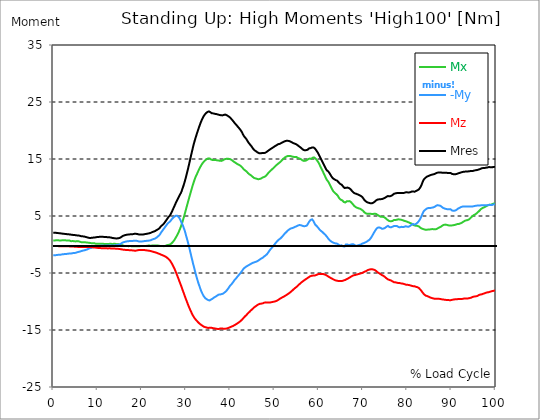
| Category |  Mx |  -My |  Mz |  Mres |
|---|---|---|---|---|
| 0.0 | 0.705 | -1.894 | -0.278 | 2.042 |
| 0.167348456675344 | 0.705 | -1.894 | -0.26 | 2.042 |
| 0.334696913350688 | 0.705 | -1.894 | -0.26 | 2.042 |
| 0.5020453700260321 | 0.743 | -1.875 | -0.278 | 2.042 |
| 0.669393826701376 | 0.761 | -1.856 | -0.278 | 2.042 |
| 0.83674228337672 | 0.78 | -1.838 | -0.278 | 2.023 |
| 1.0040907400520642 | 0.761 | -1.819 | -0.278 | 2.005 |
| 1.1621420602454444 | 0.724 | -1.838 | -0.278 | 2.005 |
| 1.3294905169207885 | 0.705 | -1.819 | -0.297 | 1.986 |
| 1.4968389735961325 | 0.687 | -1.801 | -0.297 | 1.968 |
| 1.6641874302714765 | 0.705 | -1.782 | -0.297 | 1.949 |
| 1.8315358869468206 | 0.724 | -1.764 | -0.297 | 1.931 |
| 1.9988843436221646 | 0.743 | -1.726 | -0.297 | 1.912 |
| 2.1662328002975086 | 0.743 | -1.708 | -0.297 | 1.894 |
| 2.333581256972853 | 0.724 | -1.708 | -0.297 | 1.875 |
| 2.5009297136481967 | 0.705 | -1.689 | -0.297 | 1.856 |
| 2.6682781703235405 | 0.743 | -1.652 | -0.297 | 1.856 |
| 2.8356266269988843 | 0.743 | -1.652 | -0.316 | 1.838 |
| 3.002975083674229 | 0.705 | -1.652 | -0.316 | 1.819 |
| 3.1703235403495724 | 0.687 | -1.634 | -0.316 | 1.819 |
| 3.337671997024917 | 0.705 | -1.615 | -0.316 | 1.801 |
| 3.4957233172182973 | 0.705 | -1.596 | -0.316 | 1.782 |
| 3.663071773893641 | 0.687 | -1.578 | -0.334 | 1.764 |
| 3.8304202305689854 | 0.631 | -1.578 | -0.353 | 1.745 |
| 3.997768687244329 | 0.575 | -1.578 | -0.353 | 1.726 |
| 4.165117143919673 | 0.594 | -1.541 | -0.353 | 1.708 |
| 4.332465600595017 | 0.613 | -1.522 | -0.353 | 1.689 |
| 4.499814057270361 | 0.613 | -1.504 | -0.371 | 1.671 |
| 4.667162513945706 | 0.575 | -1.485 | -0.371 | 1.671 |
| 4.834510970621049 | 0.557 | -1.485 | -0.39 | 1.652 |
| 5.001859427296393 | 0.538 | -1.467 | -0.39 | 1.634 |
| 5.169207883971737 | 0.538 | -1.429 | -0.39 | 1.615 |
| 5.336556340647081 | 0.594 | -1.374 | -0.408 | 1.596 |
| 5.503904797322425 | 0.575 | -1.337 | -0.427 | 1.578 |
| 5.671253253997769 | 0.575 | -1.299 | -0.427 | 1.596 |
| 5.82930457419115 | 0.538 | -1.281 | -0.446 | 1.578 |
| 5.996653030866494 | 0.483 | -1.244 | -0.446 | 1.522 |
| 6.164001487541838 | 0.446 | -1.188 | -0.427 | 1.485 |
| 6.331349944217181 | 0.408 | -1.151 | -0.427 | 1.448 |
| 6.498698400892526 | 0.408 | -1.095 | -0.427 | 1.429 |
| 6.66604685756787 | 0.408 | -1.077 | -0.427 | 1.429 |
| 6.833395314243213 | 0.408 | -1.058 | -0.427 | 1.429 |
| 7.000743770918558 | 0.408 | -1.021 | -0.427 | 1.392 |
| 7.168092227593902 | 0.408 | -0.984 | -0.427 | 1.355 |
| 7.335440684269246 | 0.371 | -0.947 | -0.427 | 1.318 |
| 7.50278914094459 | 0.353 | -0.891 | -0.427 | 1.281 |
| 7.6701375976199335 | 0.334 | -0.854 | -0.427 | 1.244 |
| 7.837486054295278 | 0.316 | -0.798 | -0.446 | 1.207 |
| 7.995537374488658 | 0.316 | -0.724 | -0.446 | 1.17 |
| 8.162885831164003 | 0.297 | -0.668 | -0.446 | 1.151 |
| 8.330234287839346 | 0.26 | -0.631 | -0.446 | 1.151 |
| 8.49758274451469 | 0.223 | -0.594 | -0.464 | 1.151 |
| 8.664931201190035 | 0.223 | -0.557 | -0.483 | 1.17 |
| 8.832279657865378 | 0.223 | -0.501 | -0.483 | 1.188 |
| 8.999628114540721 | 0.223 | -0.483 | -0.501 | 1.207 |
| 9.166976571216066 | 0.223 | -0.446 | -0.52 | 1.225 |
| 9.334325027891412 | 0.204 | -0.427 | -0.538 | 1.225 |
| 9.501673484566755 | 0.167 | -0.39 | -0.538 | 1.244 |
| 9.669021941242098 | 0.111 | -0.371 | -0.557 | 1.281 |
| 9.836370397917442 | 0.149 | -0.316 | -0.575 | 1.299 |
| 10.003718854592787 | 0.149 | -0.297 | -0.594 | 1.318 |
| 10.17106731126813 | 0.149 | -0.278 | -0.594 | 1.318 |
| 10.329118631461512 | 0.13 | -0.278 | -0.613 | 1.337 |
| 10.496467088136853 | 0.13 | -0.26 | -0.631 | 1.355 |
| 10.663815544812199 | 0.111 | -0.223 | -0.631 | 1.374 |
| 10.831164001487544 | 0.13 | -0.204 | -0.65 | 1.392 |
| 10.998512458162887 | 0.13 | -0.186 | -0.668 | 1.374 |
| 11.16586091483823 | 0.13 | -0.186 | -0.668 | 1.355 |
| 11.333209371513574 | 0.111 | -0.204 | -0.668 | 1.337 |
| 11.50055782818892 | 0.093 | -0.204 | -0.668 | 1.318 |
| 11.667906284864264 | 0.074 | -0.204 | -0.668 | 1.318 |
| 11.835254741539607 | 0.056 | -0.186 | -0.668 | 1.318 |
| 12.00260319821495 | 0.074 | -0.167 | -0.668 | 1.299 |
| 12.169951654890292 | 0.093 | -0.149 | -0.687 | 1.299 |
| 12.337300111565641 | 0.074 | -0.167 | -0.687 | 1.281 |
| 12.504648568240984 | 0.093 | -0.167 | -0.668 | 1.281 |
| 12.662699888434362 | 0.111 | -0.167 | -0.668 | 1.262 |
| 12.830048345109708 | 0.13 | -0.149 | -0.687 | 1.244 |
| 12.997396801785053 | 0.13 | -0.167 | -0.687 | 1.225 |
| 13.164745258460396 | 0.074 | -0.167 | -0.687 | 1.188 |
| 13.33209371513574 | 0.056 | -0.167 | -0.687 | 1.151 |
| 13.499442171811083 | 0.093 | -0.186 | -0.687 | 1.132 |
| 13.666790628486426 | 0.13 | -0.167 | -0.687 | 1.114 |
| 13.834139085161771 | 0.149 | -0.149 | -0.705 | 1.095 |
| 14.001487541837117 | 0.111 | -0.149 | -0.724 | 1.077 |
| 14.16883599851246 | 0.074 | -0.13 | -0.724 | 1.058 |
| 14.336184455187803 | 0.056 | -0.093 | -0.743 | 1.058 |
| 14.503532911863147 | 0.056 | -0.056 | -0.743 | 1.077 |
| 14.670881368538492 | 0.074 | -0.056 | -0.761 | 1.095 |
| 14.828932688731873 | 0.019 | -0.019 | -0.78 | 1.114 |
| 14.996281145407215 | -0.019 | 0.019 | -0.798 | 1.151 |
| 15.163629602082558 | -0.056 | 0.074 | -0.817 | 1.225 |
| 15.330978058757903 | -0.111 | 0.167 | -0.835 | 1.299 |
| 15.498326515433247 | -0.111 | 0.223 | -0.854 | 1.355 |
| 15.665674972108594 | -0.149 | 0.353 | -0.891 | 1.485 |
| 15.833023428783937 | -0.204 | 0.408 | -0.91 | 1.559 |
| 16.00037188545928 | -0.241 | 0.427 | -0.928 | 1.596 |
| 16.167720342134626 | -0.241 | 0.464 | -0.928 | 1.634 |
| 16.335068798809967 | -0.241 | 0.501 | -0.947 | 1.671 |
| 16.502417255485312 | -0.26 | 0.52 | -0.965 | 1.689 |
| 16.669765712160658 | -0.26 | 0.557 | -0.965 | 1.726 |
| 16.837114168836 | -0.26 | 0.575 | -0.984 | 1.726 |
| 17.004462625511344 | -0.297 | 0.575 | -0.984 | 1.745 |
| 17.16251394570472 | -0.297 | 0.613 | -0.984 | 1.764 |
| 17.32986240238007 | -0.26 | 0.631 | -1.002 | 1.782 |
| 17.497210859055414 | -0.278 | 0.631 | -1.021 | 1.782 |
| 17.664559315730756 | -0.297 | 0.613 | -1.021 | 1.782 |
| 17.8319077724061 | -0.316 | 0.613 | -1.021 | 1.801 |
| 17.999256229081443 | -0.316 | 0.631 | -1.04 | 1.819 |
| 18.166604685756788 | -0.297 | 0.65 | -1.058 | 1.838 |
| 18.333953142432133 | -0.316 | 0.668 | -1.077 | 1.875 |
| 18.501301599107478 | -0.316 | 0.687 | -1.095 | 1.894 |
| 18.668650055782823 | -0.316 | 0.668 | -1.077 | 1.875 |
| 18.835998512458165 | -0.316 | 0.631 | -1.058 | 1.856 |
| 19.00334696913351 | -0.316 | 0.613 | -1.021 | 1.838 |
| 19.170695425808855 | -0.297 | 0.575 | -1.002 | 1.801 |
| 19.338043882484197 | -0.316 | 0.538 | -0.965 | 1.764 |
| 19.496095202677576 | -0.297 | 0.538 | -0.965 | 1.764 |
| 19.66344365935292 | -0.278 | 0.538 | -0.965 | 1.745 |
| 19.830792116028263 | -0.297 | 0.538 | -0.947 | 1.745 |
| 19.998140572703612 | -0.278 | 0.538 | -0.947 | 1.764 |
| 20.165489029378953 | -0.26 | 0.538 | -0.947 | 1.764 |
| 20.3328374860543 | -0.241 | 0.557 | -0.947 | 1.764 |
| 20.500185942729644 | -0.241 | 0.594 | -0.965 | 1.782 |
| 20.667534399404985 | -0.26 | 0.613 | -0.984 | 1.819 |
| 20.83488285608033 | -0.297 | 0.613 | -1.002 | 1.819 |
| 21.002231312755672 | -0.26 | 0.631 | -1.021 | 1.856 |
| 21.16957976943102 | -0.223 | 0.65 | -1.04 | 1.894 |
| 21.336928226106362 | -0.204 | 0.668 | -1.058 | 1.912 |
| 21.504276682781704 | -0.186 | 0.668 | -1.077 | 1.949 |
| 21.67162513945705 | -0.167 | 0.687 | -1.095 | 1.968 |
| 21.82967645965043 | -0.204 | 0.705 | -1.132 | 2.005 |
| 21.997024916325774 | -0.223 | 0.743 | -1.151 | 2.042 |
| 22.16437337300112 | -0.223 | 0.817 | -1.188 | 2.116 |
| 22.33172182967646 | -0.186 | 0.873 | -1.225 | 2.172 |
| 22.499070286351806 | -0.167 | 0.928 | -1.262 | 2.228 |
| 22.666418743027148 | -0.186 | 0.965 | -1.299 | 2.265 |
| 22.833767199702496 | -0.186 | 1.002 | -1.337 | 2.32 |
| 23.00111565637784 | -0.186 | 1.04 | -1.374 | 2.358 |
| 23.168464113053183 | -0.204 | 1.114 | -1.411 | 2.45 |
| 23.335812569728528 | -0.186 | 1.207 | -1.448 | 2.525 |
| 23.50316102640387 | -0.186 | 1.299 | -1.504 | 2.599 |
| 23.670509483079215 | -0.186 | 1.429 | -1.559 | 2.673 |
| 23.83785793975456 | -0.204 | 1.504 | -1.596 | 2.729 |
| 23.995909259947936 | -0.241 | 1.671 | -1.652 | 2.859 |
| 24.163257716623285 | -0.241 | 1.856 | -1.708 | 3.007 |
| 24.330606173298627 | -0.241 | 2.079 | -1.782 | 3.212 |
| 24.49795462997397 | -0.223 | 2.246 | -1.838 | 3.323 |
| 24.665303086649313 | -0.241 | 2.432 | -1.875 | 3.416 |
| 24.83265154332466 | -0.278 | 2.618 | -1.931 | 3.564 |
| 25.0 | -0.297 | 2.766 | -1.986 | 3.676 |
| 25.167348456675345 | -0.297 | 2.97 | -2.061 | 3.861 |
| 25.334696913350694 | -0.241 | 3.137 | -2.116 | 4.01 |
| 25.502045370026035 | -0.186 | 3.323 | -2.191 | 4.214 |
| 25.669393826701377 | -0.13 | 3.509 | -2.283 | 4.418 |
| 25.836742283376722 | -0.111 | 3.657 | -2.395 | 4.585 |
| 26.004090740052067 | -0.074 | 3.806 | -2.525 | 4.789 |
| 26.17143919672741 | -0.056 | 3.917 | -2.655 | 4.938 |
| 26.329490516920792 | -0.019 | 3.991 | -2.785 | 5.068 |
| 26.49683897359613 | 0.056 | 4.14 | -2.97 | 5.291 |
| 26.66418743027148 | 0.167 | 4.325 | -3.174 | 5.551 |
| 26.831535886946828 | 0.278 | 4.492 | -3.397 | 5.81 |
| 26.998884343622166 | 0.427 | 4.641 | -3.639 | 6.108 |
| 27.166232800297514 | 0.575 | 4.789 | -3.898 | 6.386 |
| 27.333581256972852 | 0.761 | 4.864 | -4.158 | 6.664 |
| 27.5009297136482 | 0.965 | 4.975 | -4.455 | 6.961 |
| 27.668278170323543 | 1.188 | 5.031 | -4.789 | 7.258 |
| 27.835626626998888 | 1.411 | 5.049 | -5.105 | 7.518 |
| 28.002975083674233 | 1.652 | 5.031 | -5.421 | 7.778 |
| 28.170323540349575 | 1.894 | 4.919 | -5.773 | 8.057 |
| 28.33767199702492 | 2.172 | 4.808 | -6.108 | 8.317 |
| 28.50502045370026 | 2.488 | 4.622 | -6.46 | 8.576 |
| 28.663071773893645 | 2.803 | 4.4 | -6.794 | 8.818 |
| 28.830420230568986 | 3.137 | 4.103 | -7.129 | 9.041 |
| 28.99776868724433 | 3.509 | 3.787 | -7.481 | 9.338 |
| 29.165117143919673 | 3.917 | 3.546 | -7.853 | 9.746 |
| 29.33246560059502 | 4.363 | 3.23 | -8.224 | 10.117 |
| 29.499814057270367 | 4.789 | 2.859 | -8.558 | 10.507 |
| 29.66716251394571 | 5.235 | 2.506 | -8.929 | 10.934 |
| 29.834510970621054 | 5.736 | 2.079 | -9.3 | 11.417 |
| 30.00185942729639 | 6.2 | 1.578 | -9.635 | 11.881 |
| 30.169207883971744 | 6.683 | 1.132 | -9.969 | 12.401 |
| 30.33655634064708 | 7.166 | 0.668 | -10.321 | 12.939 |
| 30.50390479732243 | 7.63 | 0.167 | -10.656 | 13.459 |
| 30.671253253997772 | 8.094 | -0.334 | -10.971 | 14.016 |
| 30.829304574191156 | 8.558 | -0.891 | -11.268 | 14.591 |
| 30.996653030866494 | 9.022 | -1.448 | -11.565 | 15.167 |
| 31.164001487541842 | 9.468 | -1.986 | -11.844 | 15.724 |
| 31.331349944217187 | 9.932 | -2.525 | -12.122 | 16.28 |
| 31.498698400892525 | 10.359 | -3.063 | -12.382 | 16.837 |
| 31.666046857567874 | 10.767 | -3.583 | -12.605 | 17.376 |
| 31.833395314243212 | 11.157 | -4.084 | -12.809 | 17.858 |
| 32.00074377091856 | 11.528 | -4.604 | -12.995 | 18.323 |
| 32.1680922275939 | 11.862 | -5.105 | -13.162 | 18.749 |
| 32.33544068426925 | 12.159 | -5.569 | -13.31 | 19.158 |
| 32.50278914094459 | 12.419 | -6.033 | -13.459 | 19.566 |
| 32.670137597619934 | 12.716 | -6.46 | -13.589 | 19.956 |
| 32.83748605429528 | 12.995 | -6.869 | -13.719 | 20.346 |
| 33.004834510970625 | 13.273 | -7.24 | -13.849 | 20.717 |
| 33.162885831164004 | 13.533 | -7.611 | -13.96 | 21.089 |
| 33.33023428783935 | 13.756 | -7.982 | -14.053 | 21.423 |
| 33.497582744514695 | 13.979 | -8.298 | -14.146 | 21.738 |
| 33.664931201190036 | 14.183 | -8.576 | -14.238 | 22.035 |
| 33.83227965786538 | 14.35 | -8.836 | -14.331 | 22.295 |
| 33.99962811454073 | 14.517 | -9.059 | -14.406 | 22.537 |
| 34.16697657121607 | 14.665 | -9.226 | -14.443 | 22.722 |
| 34.33432502789141 | 14.777 | -9.412 | -14.498 | 22.889 |
| 34.50167348456676 | 14.888 | -9.542 | -14.535 | 23.038 |
| 34.6690219412421 | 14.962 | -9.598 | -14.573 | 23.131 |
| 34.83637039791744 | 15.055 | -9.653 | -14.628 | 23.242 |
| 35.00371885459279 | 15.111 | -9.746 | -14.647 | 23.316 |
| 35.17106731126814 | 15.13 | -9.783 | -14.647 | 23.353 |
| 35.338415767943474 | 15.092 | -9.82 | -14.591 | 23.316 |
| 35.49646708813686 | 15 | -9.746 | -14.573 | 23.205 |
| 35.6638155448122 | 14.907 | -9.635 | -14.591 | 23.093 |
| 35.831164001487544 | 14.814 | -9.505 | -14.647 | 23.019 |
| 35.998512458162885 | 14.814 | -9.505 | -14.665 | 23.038 |
| 36.165860914838234 | 14.795 | -9.43 | -14.684 | 23.001 |
| 36.333209371513576 | 14.814 | -9.3 | -14.703 | 22.963 |
| 36.50055782818892 | 14.814 | -9.208 | -14.721 | 22.926 |
| 36.667906284864266 | 14.814 | -9.152 | -14.758 | 22.926 |
| 36.83525474153961 | 14.795 | -9.078 | -14.777 | 22.889 |
| 37.002603198214956 | 14.777 | -8.985 | -14.795 | 22.852 |
| 37.1699516548903 | 14.758 | -8.874 | -14.833 | 22.815 |
| 37.337300111565646 | 14.721 | -8.799 | -14.833 | 22.759 |
| 37.50464856824098 | 14.684 | -8.799 | -14.795 | 22.741 |
| 37.66269988843437 | 14.703 | -8.781 | -14.758 | 22.722 |
| 37.83004834510971 | 14.684 | -8.762 | -14.74 | 22.685 |
| 37.99739680178505 | 14.665 | -8.706 | -14.721 | 22.648 |
| 38.16474525846039 | 14.703 | -8.669 | -14.74 | 22.648 |
| 38.33209371513574 | 14.777 | -8.632 | -14.758 | 22.685 |
| 38.49944217181109 | 14.851 | -8.539 | -14.758 | 22.722 |
| 38.666790628486424 | 14.944 | -8.447 | -14.777 | 22.778 |
| 38.83413908516178 | 15 | -8.354 | -14.777 | 22.796 |
| 39.001487541837115 | 15.018 | -8.242 | -14.758 | 22.741 |
| 39.16883599851246 | 15.055 | -8.094 | -14.74 | 22.704 |
| 39.336184455187805 | 15.055 | -7.927 | -14.703 | 22.629 |
| 39.503532911863154 | 15.018 | -7.76 | -14.665 | 22.537 |
| 39.670881368538495 | 15.018 | -7.574 | -14.61 | 22.444 |
| 39.83822982521384 | 15.018 | -7.37 | -14.554 | 22.351 |
| 39.996281145407224 | 14.962 | -7.184 | -14.498 | 22.202 |
| 40.163629602082565 | 14.888 | -7.054 | -14.443 | 22.091 |
| 40.33097805875791 | 14.814 | -6.924 | -14.387 | 21.98 |
| 40.498326515433256 | 14.684 | -6.757 | -14.35 | 21.794 |
| 40.6656749721086 | 14.61 | -6.572 | -14.276 | 21.645 |
| 40.83302342878393 | 14.517 | -6.386 | -14.201 | 21.478 |
| 41.00037188545929 | 14.424 | -6.2 | -14.127 | 21.293 |
| 41.16772034213463 | 14.35 | -6.052 | -14.071 | 21.163 |
| 41.33506879880997 | 14.257 | -5.922 | -13.979 | 21.014 |
| 41.50241725548531 | 14.183 | -5.773 | -13.886 | 20.866 |
| 41.66976571216066 | 14.09 | -5.588 | -13.812 | 20.699 |
| 41.837114168836 | 13.997 | -5.458 | -13.719 | 20.55 |
| 42.004462625511344 | 13.96 | -5.291 | -13.626 | 20.402 |
| 42.17181108218669 | 13.867 | -5.142 | -13.514 | 20.235 |
| 42.32986240238007 | 13.793 | -4.975 | -13.422 | 20.068 |
| 42.497210859055414 | 13.682 | -4.808 | -13.31 | 19.882 |
| 42.66455931573076 | 13.552 | -4.641 | -13.18 | 19.659 |
| 42.831907772406105 | 13.385 | -4.437 | -13.032 | 19.381 |
| 42.999256229081446 | 13.236 | -4.251 | -12.883 | 19.139 |
| 43.16660468575679 | 13.125 | -4.121 | -12.735 | 18.935 |
| 43.33395314243214 | 13.013 | -4.028 | -12.605 | 18.768 |
| 43.50130159910748 | 12.92 | -3.954 | -12.493 | 18.638 |
| 43.66865005578282 | 12.828 | -3.843 | -12.364 | 18.452 |
| 43.83599851245817 | 12.679 | -3.787 | -12.215 | 18.248 |
| 44.00334696913351 | 12.531 | -3.694 | -12.067 | 18.025 |
| 44.17069542580886 | 12.419 | -3.62 | -11.937 | 17.84 |
| 44.3380438824842 | 12.308 | -3.546 | -11.825 | 17.673 |
| 44.49609520267758 | 12.234 | -3.471 | -11.695 | 17.506 |
| 44.66344365935292 | 12.141 | -3.397 | -11.565 | 17.357 |
| 44.83079211602827 | 12.048 | -3.304 | -11.454 | 17.19 |
| 44.99814057270361 | 11.918 | -3.249 | -11.324 | 16.986 |
| 45.16548902937895 | 11.788 | -3.212 | -11.175 | 16.8 |
| 45.332837486054295 | 11.695 | -3.156 | -11.064 | 16.652 |
| 45.500185942729644 | 11.621 | -3.1 | -10.971 | 16.522 |
| 45.66753439940499 | 11.602 | -3.063 | -10.878 | 16.448 |
| 45.83488285608033 | 11.565 | -3.026 | -10.767 | 16.355 |
| 46.00223131275568 | 11.528 | -2.97 | -10.693 | 16.262 |
| 46.16957976943102 | 11.472 | -2.896 | -10.6 | 16.151 |
| 46.336928226106366 | 11.454 | -2.822 | -10.526 | 16.076 |
| 46.50427668278171 | 11.454 | -2.729 | -10.47 | 16.021 |
| 46.671625139457056 | 11.491 | -2.636 | -10.414 | 16.002 |
| 46.829676459650436 | 11.547 | -2.562 | -10.396 | 16.002 |
| 46.99702491632577 | 11.602 | -2.469 | -10.377 | 16.021 |
| 47.16437337300112 | 11.677 | -2.395 | -10.359 | 16.039 |
| 47.33172182967646 | 11.751 | -2.32 | -10.321 | 16.058 |
| 47.49907028635181 | 11.807 | -2.209 | -10.284 | 16.058 |
| 47.66641874302716 | 11.862 | -2.098 | -10.21 | 16.058 |
| 47.83376719970249 | 11.918 | -2.023 | -10.173 | 16.076 |
| 48.001115656377834 | 11.992 | -1.912 | -10.154 | 16.113 |
| 48.16846411305319 | 12.141 | -1.801 | -10.154 | 16.206 |
| 48.33581256972853 | 12.289 | -1.671 | -10.173 | 16.299 |
| 48.50316102640387 | 12.456 | -1.485 | -10.192 | 16.41 |
| 48.67050948307921 | 12.605 | -1.299 | -10.192 | 16.503 |
| 48.837857939754564 | 12.735 | -1.114 | -10.173 | 16.596 |
| 49.005206396429905 | 12.865 | -0.928 | -10.173 | 16.67 |
| 49.163257716623285 | 12.995 | -0.761 | -10.154 | 16.782 |
| 49.33060617329863 | 13.106 | -0.631 | -10.117 | 16.856 |
| 49.49795462997397 | 13.217 | -0.483 | -10.099 | 16.93 |
| 49.66530308664932 | 13.347 | -0.316 | -10.062 | 17.023 |
| 49.832651543324666 | 13.477 | -0.167 | -10.024 | 17.116 |
| 50.0 | 13.607 | 0 | -10.006 | 17.19 |
| 50.16734845667534 | 13.737 | 0.167 | -9.969 | 17.283 |
| 50.33469691335069 | 13.867 | 0.334 | -9.932 | 17.376 |
| 50.50204537002604 | 13.96 | 0.501 | -9.876 | 17.431 |
| 50.66939382670139 | 14.071 | 0.631 | -9.802 | 17.524 |
| 50.836742283376715 | 14.183 | 0.761 | -9.727 | 17.599 |
| 51.00409074005207 | 14.294 | 0.873 | -9.635 | 17.617 |
| 51.17143919672741 | 14.387 | 0.965 | -9.542 | 17.654 |
| 51.32949051692079 | 14.498 | 1.058 | -9.468 | 17.71 |
| 51.496838973596134 | 14.647 | 1.17 | -9.393 | 17.784 |
| 51.66418743027148 | 14.777 | 1.318 | -9.319 | 17.858 |
| 51.831535886946824 | 14.907 | 1.448 | -9.263 | 17.933 |
| 51.99888434362217 | 15.037 | 1.615 | -9.189 | 18.007 |
| 52.16623280029752 | 15.148 | 1.782 | -9.115 | 18.063 |
| 52.33358125697285 | 15.259 | 1.931 | -9.041 | 18.118 |
| 52.5009297136482 | 15.352 | 2.061 | -8.948 | 18.155 |
| 52.668278170323546 | 15.427 | 2.172 | -8.874 | 18.193 |
| 52.835626626998895 | 15.482 | 2.32 | -8.781 | 18.211 |
| 53.00297508367424 | 15.519 | 2.45 | -8.706 | 18.193 |
| 53.17032354034958 | 15.519 | 2.543 | -8.614 | 18.174 |
| 53.33767199702492 | 15.538 | 2.636 | -8.521 | 18.137 |
| 53.50502045370027 | 15.519 | 2.729 | -8.428 | 18.1 |
| 53.663071773893655 | 15.501 | 2.803 | -8.317 | 18.044 |
| 53.83042023056899 | 15.482 | 2.859 | -8.205 | 17.97 |
| 53.99776868724433 | 15.427 | 2.877 | -8.094 | 17.896 |
| 54.16511714391967 | 15.408 | 2.933 | -7.982 | 17.821 |
| 54.33246560059503 | 15.371 | 2.97 | -7.853 | 17.766 |
| 54.49981405727037 | 15.371 | 3.063 | -7.741 | 17.71 |
| 54.667162513945705 | 15.371 | 3.1 | -7.63 | 17.654 |
| 54.834510970621054 | 15.371 | 3.174 | -7.537 | 17.617 |
| 55.0018594272964 | 15.334 | 3.212 | -7.426 | 17.543 |
| 55.169207883971744 | 15.259 | 3.267 | -7.296 | 17.45 |
| 55.336556340647086 | 15.167 | 3.341 | -7.166 | 17.339 |
| 55.50390479732243 | 15.13 | 3.379 | -7.054 | 17.246 |
| 55.671253253997776 | 15.074 | 3.416 | -6.943 | 17.153 |
| 55.83860171067312 | 15.018 | 3.416 | -6.813 | 17.06 |
| 55.9966530308665 | 14.962 | 3.379 | -6.702 | 16.967 |
| 56.16400148754184 | 14.851 | 3.341 | -6.59 | 16.837 |
| 56.33134994421718 | 14.758 | 3.267 | -6.497 | 16.689 |
| 56.498698400892536 | 14.703 | 3.23 | -6.386 | 16.615 |
| 56.66604685756788 | 14.665 | 3.212 | -6.312 | 16.559 |
| 56.83339531424321 | 14.665 | 3.23 | -6.219 | 16.522 |
| 57.00074377091856 | 14.703 | 3.23 | -6.126 | 16.54 |
| 57.16809222759391 | 14.758 | 3.249 | -6.052 | 16.559 |
| 57.33544068426925 | 14.814 | 3.341 | -5.959 | 16.578 |
| 57.5027891409446 | 14.888 | 3.509 | -5.866 | 16.633 |
| 57.670137597619934 | 15 | 3.768 | -5.773 | 16.745 |
| 57.83748605429528 | 15.111 | 4.01 | -5.699 | 16.875 |
| 58.004834510970625 | 15.074 | 4.158 | -5.606 | 16.875 |
| 58.16288583116401 | 15.092 | 4.307 | -5.551 | 16.912 |
| 58.330234287839346 | 15.037 | 4.381 | -5.495 | 16.875 |
| 58.497582744514695 | 15.185 | 4.418 | -5.495 | 17.023 |
| 58.66493120119004 | 15.241 | 4.307 | -5.458 | 17.06 |
| 58.832279657865385 | 15.297 | 4.084 | -5.439 | 17.023 |
| 58.999628114540734 | 15.259 | 3.787 | -5.458 | 16.949 |
| 59.16697657121607 | 15.167 | 3.527 | -5.439 | 16.819 |
| 59.33432502789142 | 15.037 | 3.416 | -5.384 | 16.652 |
| 59.50167348456676 | 14.888 | 3.267 | -5.328 | 16.466 |
| 59.66902194124211 | 14.703 | 3.119 | -5.272 | 16.262 |
| 59.83637039791745 | 14.517 | 2.989 | -5.198 | 16.058 |
| 60.00371885459278 | 14.294 | 2.822 | -5.179 | 15.816 |
| 60.17106731126813 | 14.034 | 2.636 | -5.179 | 15.557 |
| 60.33841576794349 | 13.756 | 2.506 | -5.161 | 15.278 |
| 60.49646708813685 | 13.496 | 2.395 | -5.142 | 15.018 |
| 60.6638155448122 | 13.236 | 2.283 | -5.161 | 14.777 |
| 60.831164001487544 | 12.976 | 2.191 | -5.161 | 14.517 |
| 60.99851245816289 | 12.698 | 2.061 | -5.179 | 14.238 |
| 61.16586091483824 | 12.419 | 1.931 | -5.198 | 13.979 |
| 61.333209371513576 | 12.141 | 1.819 | -5.254 | 13.719 |
| 61.50055782818892 | 11.862 | 1.689 | -5.309 | 13.477 |
| 61.667906284864266 | 11.565 | 1.541 | -5.365 | 13.199 |
| 61.835254741539615 | 11.343 | 1.392 | -5.439 | 13.013 |
| 62.002603198214956 | 11.175 | 1.207 | -5.532 | 12.92 |
| 62.16995165489029 | 11.008 | 1.021 | -5.643 | 12.809 |
| 62.33730011156564 | 10.786 | 0.91 | -5.699 | 12.623 |
| 62.504648568240995 | 10.526 | 0.743 | -5.792 | 12.438 |
| 62.67199702491633 | 10.247 | 0.631 | -5.848 | 12.215 |
| 62.83004834510971 | 9.987 | 0.52 | -5.922 | 11.992 |
| 62.99739680178505 | 9.746 | 0.446 | -5.996 | 11.825 |
| 63.1647452584604 | 9.505 | 0.371 | -6.052 | 11.64 |
| 63.33209371513575 | 9.3 | 0.316 | -6.126 | 11.528 |
| 63.4994421718111 | 9.171 | 0.26 | -6.182 | 11.454 |
| 63.666790628486424 | 9.041 | 0.204 | -6.256 | 11.361 |
| 63.83413908516177 | 8.929 | 0.186 | -6.293 | 11.305 |
| 64.00148754183712 | 8.818 | 0.167 | -6.33 | 11.25 |
| 64.16883599851248 | 8.706 | 0.149 | -6.349 | 11.194 |
| 64.3361844551878 | 8.539 | 0.074 | -6.386 | 11.083 |
| 64.50353291186315 | 8.298 | -0.037 | -6.405 | 10.916 |
| 64.6708813685385 | 8.094 | -0.13 | -6.423 | 10.748 |
| 64.83822982521384 | 7.945 | -0.204 | -6.442 | 10.637 |
| 65.00557828188919 | 7.853 | -0.204 | -6.423 | 10.544 |
| 65.16362960208257 | 7.853 | -0.149 | -6.423 | 10.507 |
| 65.3309780587579 | 7.741 | -0.186 | -6.386 | 10.377 |
| 65.49832651543326 | 7.593 | -0.316 | -6.33 | 10.192 |
| 65.6656749721086 | 7.463 | -0.39 | -6.293 | 10.024 |
| 65.83302342878395 | 7.37 | -0.353 | -6.237 | 9.913 |
| 66.00037188545929 | 7.37 | -0.186 | -6.219 | 9.895 |
| 66.16772034213463 | 7.481 | 0.019 | -6.145 | 9.95 |
| 66.33506879880998 | 7.574 | 0.074 | -6.07 | 9.987 |
| 66.50241725548531 | 7.648 | 0 | -5.996 | 9.987 |
| 66.66976571216065 | 7.593 | -0.037 | -5.94 | 9.913 |
| 66.83711416883601 | 7.63 | -0.111 | -5.866 | 9.895 |
| 67.00446262551135 | 7.611 | -0.093 | -5.792 | 9.839 |
| 67.1718110821867 | 7.537 | -0.037 | -5.718 | 9.727 |
| 67.32986240238007 | 7.407 | 0.019 | -5.625 | 9.579 |
| 67.49721085905541 | 7.258 | 0.037 | -5.532 | 9.412 |
| 67.66455931573076 | 7.11 | 0.056 | -5.476 | 9.263 |
| 67.83190777240611 | 6.943 | 0.037 | -5.421 | 9.133 |
| 67.99925622908145 | 6.794 | -0.037 | -5.384 | 9.041 |
| 68.16660468575678 | 6.683 | -0.13 | -5.346 | 8.966 |
| 68.33395314243214 | 6.572 | -0.204 | -5.328 | 8.929 |
| 68.50130159910749 | 6.497 | -0.241 | -5.291 | 8.892 |
| 68.66865005578282 | 6.442 | -0.223 | -5.254 | 8.836 |
| 68.83599851245816 | 6.386 | -0.167 | -5.216 | 8.781 |
| 69.00334696913352 | 6.349 | -0.111 | -5.179 | 8.725 |
| 69.17069542580886 | 6.312 | -0.074 | -5.142 | 8.669 |
| 69.3380438824842 | 6.275 | -0.037 | -5.105 | 8.632 |
| 69.50539233915956 | 6.2 | 0 | -5.068 | 8.539 |
| 69.66344365935292 | 6.126 | 0.074 | -5.031 | 8.428 |
| 69.83079211602826 | 6.052 | 0.149 | -4.975 | 8.335 |
| 69.99814057270362 | 5.922 | 0.186 | -4.919 | 8.168 |
| 70.16548902937896 | 5.792 | 0.241 | -4.864 | 8.001 |
| 70.33283748605429 | 5.643 | 0.278 | -4.789 | 7.797 |
| 70.50018594272964 | 5.551 | 0.353 | -4.734 | 7.667 |
| 70.667534399405 | 5.458 | 0.39 | -4.678 | 7.555 |
| 70.83488285608033 | 5.421 | 0.483 | -4.585 | 7.444 |
| 71.00223131275568 | 5.384 | 0.575 | -4.53 | 7.388 |
| 71.16957976943102 | 5.384 | 0.668 | -4.474 | 7.351 |
| 71.33692822610637 | 5.384 | 0.761 | -4.418 | 7.314 |
| 71.50427668278171 | 5.384 | 0.854 | -4.4 | 7.277 |
| 71.67162513945706 | 5.384 | 1.002 | -4.363 | 7.24 |
| 71.8389735961324 | 5.384 | 1.188 | -4.344 | 7.203 |
| 71.99702491632577 | 5.365 | 1.411 | -4.344 | 7.221 |
| 72.16437337300113 | 5.365 | 1.615 | -4.363 | 7.24 |
| 72.33172182967647 | 5.365 | 1.856 | -4.381 | 7.333 |
| 72.49907028635181 | 5.384 | 2.098 | -4.418 | 7.426 |
| 72.66641874302715 | 5.402 | 2.302 | -4.474 | 7.518 |
| 72.8337671997025 | 5.384 | 2.506 | -4.548 | 7.63 |
| 73.00111565637783 | 5.346 | 2.71 | -4.66 | 7.76 |
| 73.16846411305319 | 5.272 | 2.859 | -4.771 | 7.853 |
| 73.33581256972853 | 5.179 | 2.952 | -4.882 | 7.89 |
| 73.50316102640387 | 5.086 | 2.933 | -4.994 | 7.908 |
| 73.67050948307921 | 5.012 | 2.989 | -5.049 | 7.927 |
| 73.83785793975457 | 4.938 | 2.97 | -5.124 | 7.927 |
| 74.00520639642991 | 4.882 | 2.915 | -5.216 | 7.945 |
| 74.16325771662328 | 4.864 | 2.84 | -5.309 | 7.964 |
| 74.33060617329863 | 4.864 | 2.747 | -5.384 | 7.982 |
| 74.49795462997398 | 4.864 | 2.71 | -5.458 | 8.001 |
| 74.66530308664932 | 4.827 | 2.803 | -5.513 | 8.075 |
| 74.83265154332466 | 4.771 | 2.84 | -5.606 | 8.131 |
| 75.00000000000001 | 4.697 | 2.915 | -5.718 | 8.205 |
| 75.16734845667534 | 4.604 | 2.989 | -5.81 | 8.261 |
| 75.3346969133507 | 4.455 | 3.119 | -5.94 | 8.372 |
| 75.50204537002605 | 4.344 | 3.193 | -6.07 | 8.465 |
| 75.66939382670138 | 4.251 | 3.267 | -6.126 | 8.502 |
| 75.83674228337672 | 4.158 | 3.193 | -6.182 | 8.484 |
| 76.00409074005208 | 4.103 | 3.063 | -6.219 | 8.447 |
| 76.17143919672742 | 4.084 | 2.97 | -6.256 | 8.428 |
| 76.33878765340276 | 4.084 | 3.007 | -6.312 | 8.521 |
| 76.49683897359614 | 4.084 | 3.082 | -6.386 | 8.595 |
| 76.66418743027148 | 4.121 | 3.119 | -6.46 | 8.669 |
| 76.83153588694682 | 4.195 | 3.174 | -6.534 | 8.799 |
| 76.99888434362218 | 4.288 | 3.23 | -6.609 | 8.892 |
| 77.16623280029752 | 4.307 | 3.212 | -6.627 | 8.911 |
| 77.33358125697285 | 4.288 | 3.249 | -6.627 | 8.966 |
| 77.5009297136482 | 4.307 | 3.267 | -6.664 | 8.985 |
| 77.66827817032356 | 4.344 | 3.249 | -6.702 | 9.022 |
| 77.83562662699889 | 4.4 | 3.174 | -6.739 | 9.041 |
| 78.00297508367423 | 4.418 | 3.082 | -6.757 | 9.041 |
| 78.17032354034959 | 4.4 | 3.026 | -6.757 | 9.022 |
| 78.33767199702493 | 4.381 | 3.007 | -6.776 | 9.022 |
| 78.50502045370027 | 4.344 | 3.063 | -6.794 | 9.022 |
| 78.67236891037561 | 4.344 | 3.1 | -6.831 | 9.041 |
| 78.83042023056899 | 4.307 | 3.1 | -6.85 | 9.059 |
| 78.99776868724433 | 4.251 | 3.063 | -6.869 | 9.041 |
| 79.16511714391969 | 4.177 | 3.063 | -6.887 | 9.022 |
| 79.33246560059503 | 4.158 | 3.1 | -6.943 | 9.059 |
| 79.49981405727036 | 4.121 | 3.156 | -6.999 | 9.115 |
| 79.66716251394571 | 4.084 | 3.193 | -7.036 | 9.152 |
| 79.83451097062107 | 4.047 | 3.174 | -7.054 | 9.152 |
| 80.00185942729641 | 3.991 | 3.137 | -7.073 | 9.152 |
| 80.16920788397174 | 3.936 | 3.1 | -7.073 | 9.115 |
| 80.33655634064709 | 3.88 | 3.119 | -7.091 | 9.115 |
| 80.50390479732243 | 3.806 | 3.193 | -7.147 | 9.152 |
| 80.67125325399778 | 3.768 | 3.267 | -7.166 | 9.171 |
| 80.83860171067312 | 3.731 | 3.379 | -7.203 | 9.245 |
| 80.99665303086651 | 3.657 | 3.471 | -7.24 | 9.282 |
| 81.16400148754184 | 3.564 | 3.509 | -7.277 | 9.282 |
| 81.3313499442172 | 3.453 | 3.583 | -7.314 | 9.3 |
| 81.49869840089255 | 3.397 | 3.527 | -7.314 | 9.282 |
| 81.66604685756786 | 3.341 | 3.49 | -7.333 | 9.263 |
| 81.83339531424322 | 3.304 | 3.527 | -7.37 | 9.319 |
| 82.00074377091858 | 3.286 | 3.62 | -7.426 | 9.393 |
| 82.16809222759392 | 3.267 | 3.731 | -7.481 | 9.449 |
| 82.33544068426926 | 3.267 | 3.824 | -7.5 | 9.505 |
| 82.50278914094459 | 3.23 | 3.954 | -7.555 | 9.579 |
| 82.67013759761994 | 3.156 | 4.14 | -7.648 | 9.69 |
| 82.83748605429528 | 3.063 | 4.344 | -7.76 | 9.857 |
| 83.00483451097062 | 2.933 | 4.604 | -7.927 | 10.062 |
| 83.17218296764597 | 2.859 | 4.845 | -8.075 | 10.303 |
| 83.33023428783935 | 2.785 | 5.161 | -8.261 | 10.637 |
| 83.4975827445147 | 2.729 | 5.458 | -8.447 | 10.971 |
| 83.66493120119004 | 2.692 | 5.736 | -8.614 | 11.268 |
| 83.83227965786537 | 2.673 | 5.922 | -8.744 | 11.472 |
| 83.99962811454073 | 2.618 | 6.052 | -8.855 | 11.621 |
| 84.16697657121607 | 2.58 | 6.145 | -8.966 | 11.732 |
| 84.33432502789142 | 2.58 | 6.237 | -9.003 | 11.807 |
| 84.50167348456677 | 2.599 | 6.33 | -9.041 | 11.918 |
| 84.6690219412421 | 2.618 | 6.386 | -9.096 | 11.992 |
| 84.83637039791745 | 2.618 | 6.405 | -9.152 | 12.029 |
| 85.0037188545928 | 2.618 | 6.405 | -9.208 | 12.067 |
| 85.17106731126813 | 2.636 | 6.405 | -9.282 | 12.141 |
| 85.33841576794349 | 2.673 | 6.423 | -9.338 | 12.178 |
| 85.50576422461883 | 2.71 | 6.442 | -9.375 | 12.234 |
| 85.66381554481221 | 2.71 | 6.46 | -9.412 | 12.252 |
| 85.83116400148755 | 2.71 | 6.497 | -9.449 | 12.289 |
| 85.99851245816289 | 2.673 | 6.572 | -9.486 | 12.345 |
| 86.16586091483823 | 2.636 | 6.59 | -9.505 | 12.364 |
| 86.33320937151358 | 2.655 | 6.683 | -9.505 | 12.419 |
| 86.50055782818893 | 2.692 | 6.776 | -9.523 | 12.493 |
| 86.66790628486427 | 2.729 | 6.85 | -9.542 | 12.549 |
| 86.83525474153961 | 2.785 | 6.906 | -9.523 | 12.605 |
| 87.00260319821496 | 2.877 | 6.906 | -9.523 | 12.623 |
| 87.16995165489031 | 2.952 | 6.85 | -9.523 | 12.623 |
| 87.33730011156564 | 3.007 | 6.813 | -9.542 | 12.605 |
| 87.504648568241 | 3.026 | 6.794 | -9.56 | 12.642 |
| 87.67199702491634 | 3.137 | 6.702 | -9.598 | 12.623 |
| 87.83004834510972 | 3.267 | 6.59 | -9.616 | 12.605 |
| 87.99739680178506 | 3.341 | 6.497 | -9.635 | 12.605 |
| 88.1647452584604 | 3.416 | 6.405 | -9.653 | 12.586 |
| 88.33209371513574 | 3.453 | 6.349 | -9.69 | 12.586 |
| 88.49944217181108 | 3.471 | 6.293 | -9.69 | 12.586 |
| 88.66679062848644 | 3.49 | 6.275 | -9.709 | 12.586 |
| 88.83413908516178 | 3.49 | 6.237 | -9.727 | 12.586 |
| 89.00148754183712 | 3.434 | 6.2 | -9.727 | 12.568 |
| 89.16883599851246 | 3.397 | 6.163 | -9.727 | 12.549 |
| 89.33618445518782 | 3.36 | 6.145 | -9.746 | 12.531 |
| 89.50353291186315 | 3.341 | 6.163 | -9.765 | 12.531 |
| 89.6708813685385 | 3.323 | 6.163 | -9.765 | 12.531 |
| 89.83822982521386 | 3.323 | 6.163 | -9.765 | 12.531 |
| 90.00557828188919 | 3.323 | 6.126 | -9.765 | 12.512 |
| 90.16362960208257 | 3.341 | 5.959 | -9.709 | 12.382 |
| 90.3309780587579 | 3.379 | 5.866 | -9.672 | 12.326 |
| 90.49832651543326 | 3.397 | 5.903 | -9.653 | 12.326 |
| 90.66567497210859 | 3.416 | 5.94 | -9.635 | 12.345 |
| 90.83302342878395 | 3.453 | 5.959 | -9.616 | 12.326 |
| 91.00037188545929 | 3.49 | 5.996 | -9.598 | 12.345 |
| 91.16772034213463 | 3.527 | 6.089 | -9.598 | 12.364 |
| 91.33506879880998 | 3.583 | 6.219 | -9.598 | 12.438 |
| 91.50241725548533 | 3.601 | 6.293 | -9.579 | 12.475 |
| 91.66976571216065 | 3.601 | 6.349 | -9.579 | 12.493 |
| 91.83711416883601 | 3.639 | 6.423 | -9.579 | 12.549 |
| 92.00446262551137 | 3.694 | 6.497 | -9.579 | 12.586 |
| 92.1718110821867 | 3.75 | 6.572 | -9.579 | 12.642 |
| 92.33915953886203 | 3.806 | 6.609 | -9.56 | 12.679 |
| 92.49721085905541 | 3.88 | 6.646 | -9.542 | 12.716 |
| 92.66455931573077 | 3.973 | 6.664 | -9.523 | 12.753 |
| 92.83190777240611 | 4.065 | 6.664 | -9.486 | 12.772 |
| 92.99925622908145 | 4.14 | 6.664 | -9.468 | 12.79 |
| 93.1666046857568 | 4.177 | 6.664 | -9.468 | 12.79 |
| 93.33395314243214 | 4.233 | 6.683 | -9.468 | 12.809 |
| 93.50130159910749 | 4.27 | 6.683 | -9.468 | 12.828 |
| 93.66865005578283 | 4.288 | 6.683 | -9.468 | 12.828 |
| 93.83599851245818 | 4.307 | 6.683 | -9.449 | 12.828 |
| 94.00334696913353 | 4.418 | 6.664 | -9.43 | 12.828 |
| 94.17069542580886 | 4.585 | 6.664 | -9.393 | 12.865 |
| 94.3380438824842 | 4.66 | 6.683 | -9.375 | 12.883 |
| 94.50539233915954 | 4.771 | 6.683 | -9.319 | 12.902 |
| 94.66344365935292 | 4.901 | 6.683 | -9.245 | 12.902 |
| 94.83079211602828 | 5.012 | 6.683 | -9.189 | 12.902 |
| 94.99814057270362 | 5.142 | 6.702 | -9.133 | 12.939 |
| 95.16548902937897 | 5.216 | 6.739 | -9.133 | 12.976 |
| 95.33283748605432 | 5.254 | 6.757 | -9.133 | 12.976 |
| 95.50018594272963 | 5.365 | 6.794 | -9.096 | 13.032 |
| 95.66753439940499 | 5.439 | 6.831 | -9.096 | 13.05 |
| 95.83488285608034 | 5.532 | 6.831 | -9.041 | 13.069 |
| 96.00223131275567 | 5.681 | 6.831 | -8.948 | 13.106 |
| 96.16957976943102 | 5.81 | 6.85 | -8.892 | 13.162 |
| 96.33692822610638 | 5.922 | 6.869 | -8.836 | 13.199 |
| 96.50427668278171 | 6.07 | 6.85 | -8.781 | 13.236 |
| 96.67162513945706 | 6.2 | 6.85 | -8.762 | 13.31 |
| 96.8389735961324 | 6.312 | 6.887 | -8.744 | 13.366 |
| 96.99702491632577 | 6.386 | 6.906 | -8.706 | 13.403 |
| 97.16437337300111 | 6.442 | 6.906 | -8.651 | 13.422 |
| 97.33172182967647 | 6.497 | 6.906 | -8.614 | 13.422 |
| 97.49907028635181 | 6.553 | 6.887 | -8.558 | 13.422 |
| 97.66641874302715 | 6.627 | 6.887 | -8.502 | 13.44 |
| 97.8337671997025 | 6.702 | 6.906 | -8.465 | 13.477 |
| 98.00111565637785 | 6.776 | 6.887 | -8.428 | 13.496 |
| 98.16846411305319 | 6.831 | 6.869 | -8.391 | 13.514 |
| 98.33581256972855 | 6.906 | 6.906 | -8.372 | 13.552 |
| 98.50316102640389 | 6.961 | 6.961 | -8.354 | 13.589 |
| 98.67050948307921 | 6.98 | 6.961 | -8.317 | 13.589 |
| 98.83785793975456 | 6.98 | 6.943 | -8.261 | 13.552 |
| 99.0052063964299 | 6.999 | 6.924 | -8.224 | 13.514 |
| 99.17255485310525 | 7.054 | 6.924 | -8.187 | 13.533 |
| 99.33060617329863 | 7.11 | 6.98 | -8.168 | 13.589 |
| 99.49795462997399 | 7.166 | 7.036 | -8.131 | 13.607 |
| 99.66530308664933 | 7.203 | 7.054 | -8.094 | 13.626 |
| 99.83265154332467 | 7.203 | 7.054 | -8.057 | 13.589 |
| 100.0 | 7.184 | 7.036 | -8.001 | 13.533 |